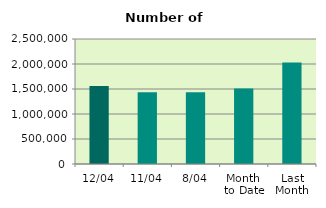
| Category | Series 0 |
|---|---|
| 12/04 | 1560800 |
| 11/04 | 1434998 |
| 8/04 | 1434812 |
| Month 
to Date | 1509905 |
| Last
Month | 2030137.913 |